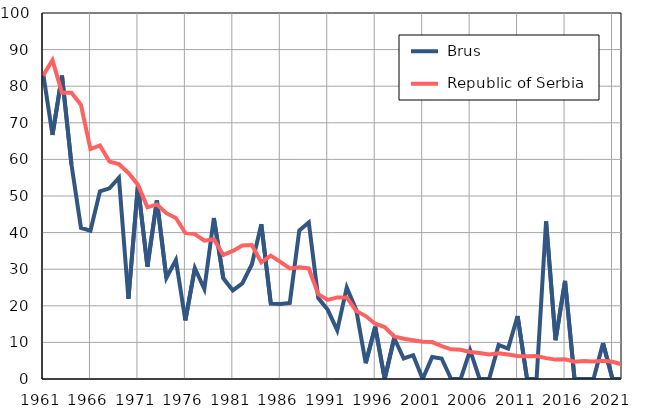
| Category |  Brus |  Republic of Serbia |
|---|---|---|
| 1961.0 | 83.7 | 82.9 |
| 1962.0 | 66.7 | 87.1 |
| 1963.0 | 82.9 | 78.2 |
| 1964.0 | 58.6 | 78.2 |
| 1965.0 | 41.3 | 74.9 |
| 1966.0 | 40.5 | 62.8 |
| 1967.0 | 51.3 | 63.8 |
| 1968.0 | 52.1 | 59.4 |
| 1969.0 | 55 | 58.7 |
| 1970.0 | 21.9 | 56.3 |
| 1971.0 | 52.9 | 53.1 |
| 1972.0 | 30.7 | 46.9 |
| 1973.0 | 48.8 | 47.7 |
| 1974.0 | 27.6 | 45.3 |
| 1975.0 | 32.5 | 44 |
| 1976.0 | 16 | 39.9 |
| 1977.0 | 30.3 | 39.6 |
| 1978.0 | 24.6 | 37.8 |
| 1979.0 | 44 | 38.2 |
| 1980.0 | 27.5 | 33.9 |
| 1981.0 | 24.2 | 35 |
| 1982.0 | 26.1 | 36.5 |
| 1983.0 | 31.3 | 36.6 |
| 1984.0 | 42.3 | 31.9 |
| 1985.0 | 20.6 | 33.7 |
| 1986.0 | 20.5 | 32 |
| 1987.0 | 20.8 | 30.2 |
| 1988.0 | 40.6 | 30.5 |
| 1989.0 | 42.8 | 30.2 |
| 1990.0 | 22.1 | 23.2 |
| 1991.0 | 18.9 | 21.6 |
| 1992.0 | 13.3 | 22.3 |
| 1993.0 | 25 | 22.3 |
| 1994.0 | 18.9 | 18.6 |
| 1995.0 | 4.3 | 17.2 |
| 1996.0 | 14.3 | 15.1 |
| 1997.0 | 0 | 14.2 |
| 1998.0 | 11.2 | 11.6 |
| 1999.0 | 5.6 | 11 |
| 2000.0 | 6.5 | 10.6 |
| 2001.0 | 0 | 10.2 |
| 2002.0 | 6 | 10.1 |
| 2003.0 | 5.6 | 9 |
| 2004.0 | 0 | 8.1 |
| 2005.0 | 0 | 8 |
| 2006.0 | 7.8 | 7.4 |
| 2007.0 | 0 | 7.1 |
| 2008.0 | 0 | 6.7 |
| 2009.0 | 9.3 | 7 |
| 2010.0 | 8.3 | 6.7 |
| 2011.0 | 17.2 | 6.3 |
| 2012.0 | 0 | 6.2 |
| 2013.0 | 0 | 6.3 |
| 2014.0 | 43.1 | 5.7 |
| 2015.0 | 10.6 | 5.3 |
| 2016.0 | 26.8 | 5.4 |
| 2017.0 | 0 | 4.7 |
| 2018.0 | 0 | 4.9 |
| 2019.0 | 0 | 4.8 |
| 2020.0 | 9.8 | 5 |
| 2021.0 | 0 | 4.7 |
| 2022.0 | 0 | 4 |